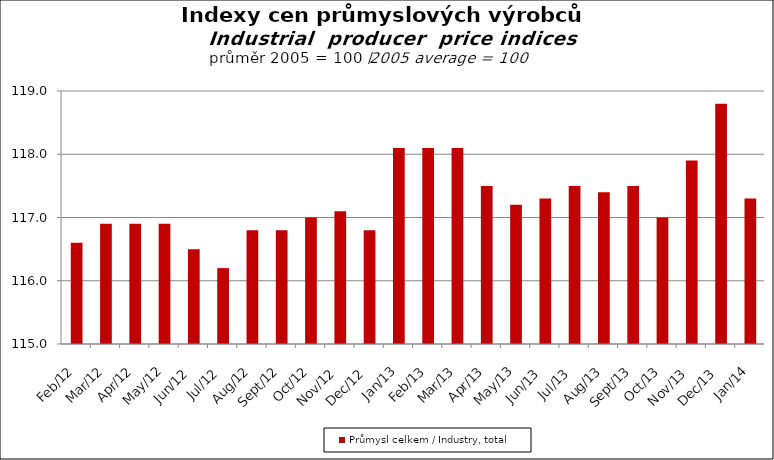
| Category | Průmysl celkem / Industry, total |
|---|---|
| 2012-02-01 | 116.6 |
| 2012-03-01 | 116.9 |
| 2012-04-01 | 116.9 |
| 2012-05-01 | 116.9 |
| 2012-06-01 | 116.5 |
| 2012-07-01 | 116.2 |
| 2012-08-01 | 116.8 |
| 2012-09-01 | 116.8 |
| 2012-10-01 | 117 |
| 2012-11-01 | 117.1 |
| 2012-12-01 | 116.8 |
| 2013-01-01 | 118.1 |
| 2013-02-01 | 118.1 |
| 2013-03-01 | 118.1 |
| 2013-04-01 | 117.5 |
| 2013-05-01 | 117.2 |
| 2013-06-01 | 117.3 |
| 2013-07-01 | 117.5 |
| 2013-08-01 | 117.4 |
| 2013-09-01 | 117.5 |
| 2013-10-01 | 117 |
| 2013-11-01 | 117.9 |
| 2013-12-01 | 118.8 |
| 2014-01-01 | 117.3 |